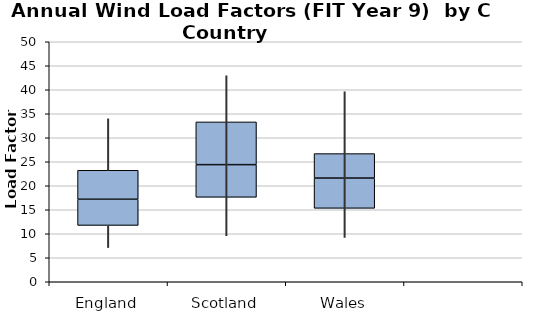
| Category | Series 0 | Series 1 | Series 2 |
|---|---|---|---|
| 0 | 11.738 | 5.45 | 6.038 |
| 1 | 17.6 | 6.8 | 8.9 |
| 2 | 15.3 | 6.3 | 5.1 |